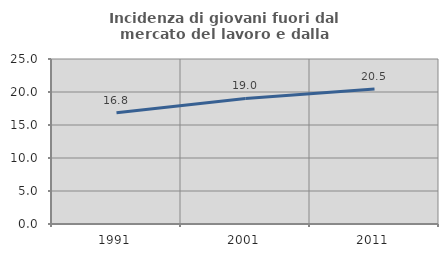
| Category | Incidenza di giovani fuori dal mercato del lavoro e dalla formazione  |
|---|---|
| 1991.0 | 16.85 |
| 2001.0 | 19.031 |
| 2011.0 | 20.463 |